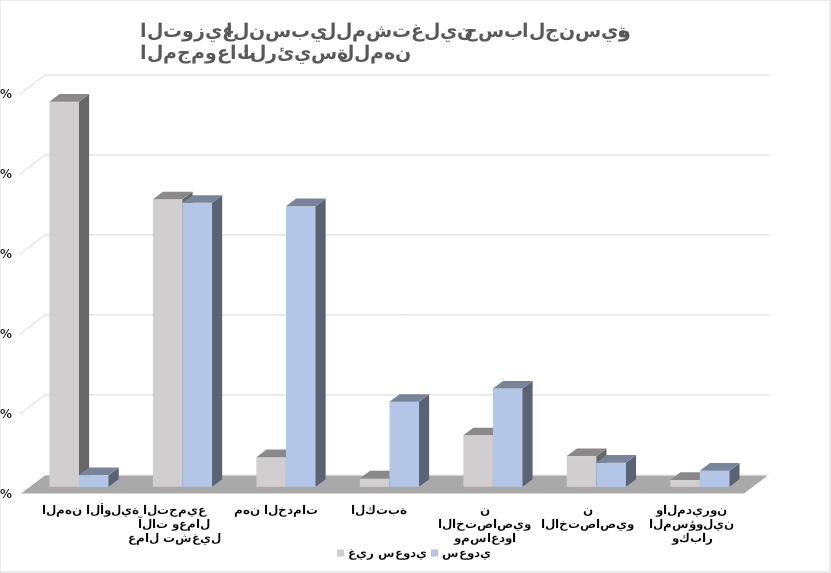
| Category | غير سعودي  | سعودي  |
|---|---|---|
| المشرعون وكبار المسؤولين والمديرون | 0.009 | 0.02 |
| الاختصاصيون | 0.038 | 0.03 |
| الفنيون ومساعدوا الاختصاصيون | 0.064 | 0.123 |
| الكتبة | 0.01 | 0.106 |
| مهن الخدمات | 0.037 | 0.351 |
| عمال تشغيل آلات وعمال التجميع | 0.359 | 0.355 |
| المهن الأولية | 0.482 | 0.015 |